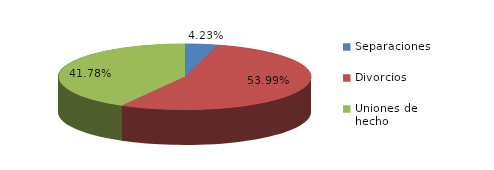
| Category | Series 0 |
|---|---|
| Separaciones | 9 |
| Divorcios | 115 |
| Uniones de hecho | 89 |